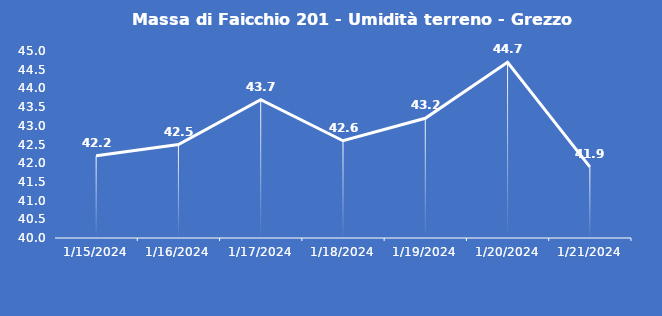
| Category | Massa di Faicchio 201 - Umidità terreno - Grezzo (%VWC) |
|---|---|
| 1/15/24 | 42.2 |
| 1/16/24 | 42.5 |
| 1/17/24 | 43.7 |
| 1/18/24 | 42.6 |
| 1/19/24 | 43.2 |
| 1/20/24 | 44.7 |
| 1/21/24 | 41.9 |